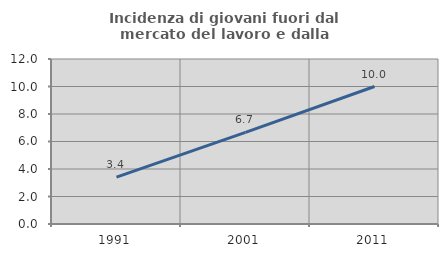
| Category | Incidenza di giovani fuori dal mercato del lavoro e dalla formazione  |
|---|---|
| 1991.0 | 3.409 |
| 2001.0 | 6.667 |
| 2011.0 | 10 |